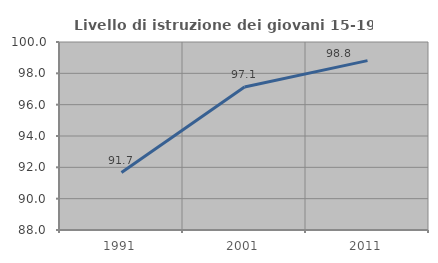
| Category | Livello di istruzione dei giovani 15-19 anni |
|---|---|
| 1991.0 | 91.667 |
| 2001.0 | 97.126 |
| 2011.0 | 98.81 |